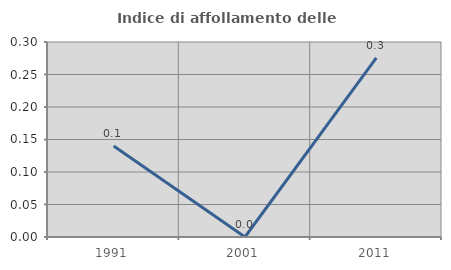
| Category | Indice di affollamento delle abitazioni  |
|---|---|
| 1991.0 | 0.14 |
| 2001.0 | 0 |
| 2011.0 | 0.275 |